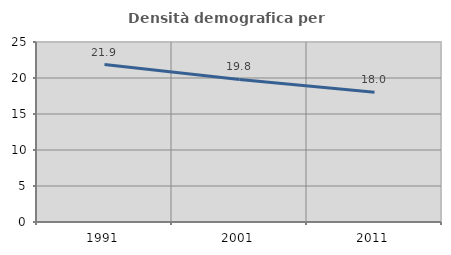
| Category | Densità demografica |
|---|---|
| 1991.0 | 21.871 |
| 2001.0 | 19.797 |
| 2011.0 | 18.037 |